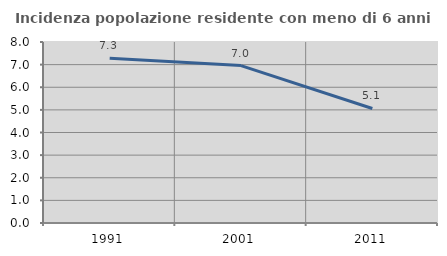
| Category | Incidenza popolazione residente con meno di 6 anni |
|---|---|
| 1991.0 | 7.282 |
| 2001.0 | 6.957 |
| 2011.0 | 5.062 |